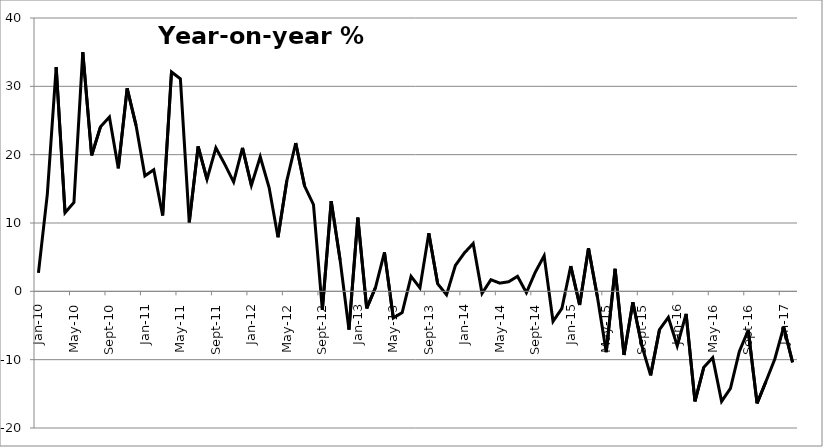
| Category | Series 0 |
|---|---|
| 2010-01-01 | 2.7 |
| 2010-02-01 | 14.2 |
| 2010-03-01 | 32.8 |
| 2010-04-01 | 11.5 |
| 2010-05-01 | 13 |
| 2010-06-01 | 35 |
| 2010-07-01 | 19.9 |
| 2010-08-01 | 24.1 |
| 2010-09-01 | 25.5 |
| 2010-10-01 | 18 |
| 2010-11-01 | 29.7 |
| 2010-12-01 | 24.3 |
| 2011-01-01 | 16.9 |
| 2011-02-01 | 17.8 |
| 2011-03-01 | 11.1 |
| 2011-04-01 | 32.1 |
| 2011-05-01 | 31.1 |
| 2011-06-01 | 10.1 |
| 2011-07-01 | 21.2 |
| 2011-08-01 | 16.4 |
| 2011-09-01 | 21 |
| 2011-10-01 | 18.6 |
| 2011-11-01 | 16 |
| 2011-12-01 | 21 |
| 2012-01-01 | 15.5 |
| 2012-02-01 | 19.7 |
| 2012-03-01 | 15.2 |
| 2012-04-01 | 7.9 |
| 2012-05-01 | 16.2 |
| 2012-06-01 | 21.7 |
| 2012-07-01 | 15.4 |
| 2012-08-01 | 12.7 |
| 2012-09-01 | -2.7 |
| 2012-10-01 | 13.2 |
| 2012-11-01 | 4.6 |
| 2012-12-01 | -5.6 |
| 2013-01-01 | 10.8 |
| 2013-02-01 | -2.5 |
| 2013-03-01 | 0.6 |
| 2013-04-01 | 5.7 |
| 2013-05-01 | -3.9 |
| 2013-06-01 | -3.1 |
| 2013-07-01 | 2.2 |
| 2013-08-01 | 0.5 |
| 2013-09-01 | 8.5 |
| 2013-10-01 | 1.1 |
| 2013-11-01 | -0.5 |
| 2013-12-01 | 3.8 |
| 2014-01-01 | 5.6 |
| 2014-02-01 | 7 |
| 2014-03-01 | -0.3 |
| 2014-04-01 | 1.7 |
| 2014-05-01 | 1.2 |
| 2014-06-01 | 1.4 |
| 2014-07-01 | 2.2 |
| 2014-08-01 | -0.2 |
| 2014-09-01 | 2.8 |
| 2014-10-01 | 5.2 |
| 2014-11-01 | -4.4 |
| 2014-12-01 | -2.5 |
| 2015-01-01 | 3.7 |
| 2015-02-01 | -2 |
| 2015-03-01 | 6.3 |
| 2015-04-01 | -0.8 |
| 2015-05-01 | -8.9 |
| 2015-06-01 | 3.3 |
| 2015-07-01 | -9.3 |
| 2015-08-01 | -1.6 |
| 2015-09-01 | -7.9 |
| 2015-10-01 | -12.3 |
| 2015-11-01 | -5.6 |
| 2015-12-01 | -3.8 |
| 2016-01-01 | -8 |
| 2016-02-01 | -3.3 |
| 2016-03-01 | -16.1 |
| 2016-04-01 | -11.1 |
| 2016-05-01 | -9.7 |
| 2016-06-01 | -16.1 |
| 2016-07-01 | -14.2 |
| 2016-08-01 | -8.8 |
| 2016-09-01 | -5.7 |
| 2016-10-01 | -16.4 |
| 2016-11-01 | -13.2 |
| 2016-12-01 | -9.9 |
| 2017-01-01 | -5.2 |
| 2017-02-01 | -10.4 |